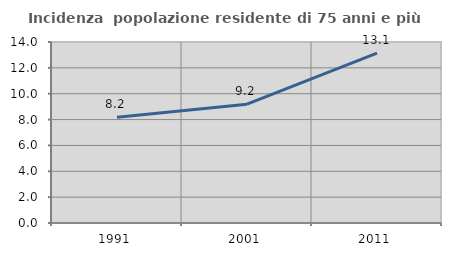
| Category | Incidenza  popolazione residente di 75 anni e più |
|---|---|
| 1991.0 | 8.188 |
| 2001.0 | 9.19 |
| 2011.0 | 13.136 |